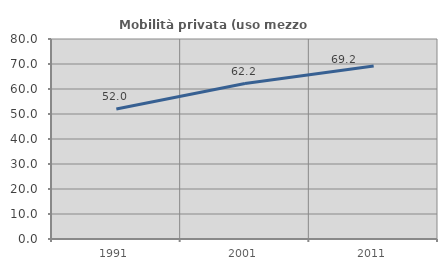
| Category | Mobilità privata (uso mezzo privato) |
|---|---|
| 1991.0 | 51.983 |
| 2001.0 | 62.185 |
| 2011.0 | 69.176 |